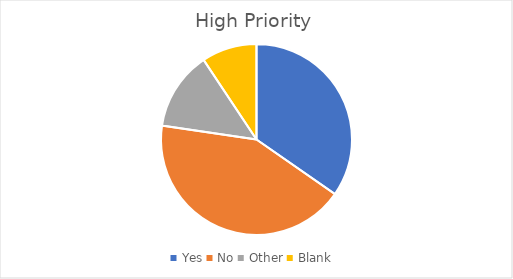
| Category | Series 0 |
|---|---|
| Yes | 26 |
| No | 32 |
| Other | 10 |
| Blank | 7 |